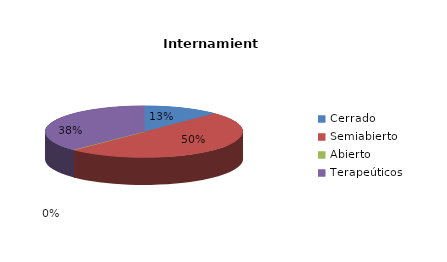
| Category | Series 0 |
|---|---|
| Cerrado | 1 |
| Semiabierto | 4 |
| Abierto | 0 |
| Terapeúticos | 3 |